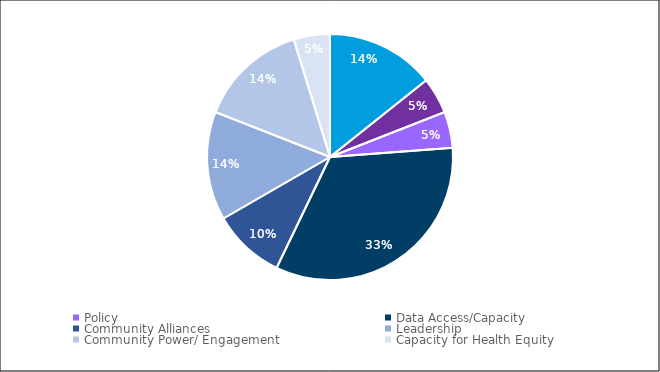
| Category | Votes for "What Focus Area stood out as most important?" |
|---|---|
| Resources | 3 |
| Workforce | 1 |
| Policy | 1 |
| Data Access/Capacity | 7 |
| Community Alliances | 2 |
| Leadership | 3 |
| Community Power/ Engagement | 3 |
| Capacity for Health Equity | 1 |